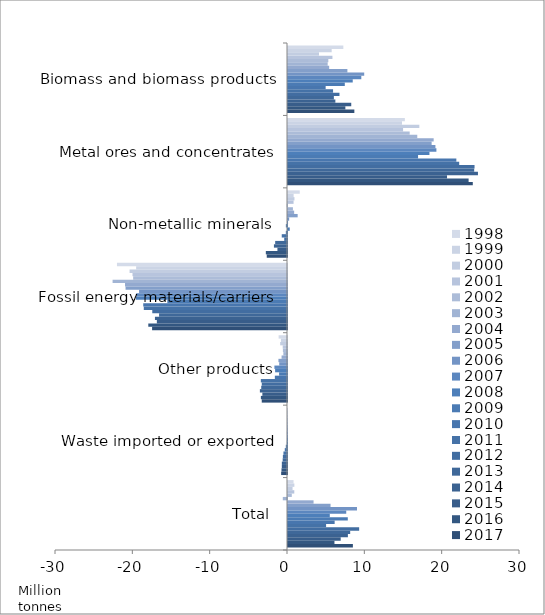
| Category | 1998 | 1999 | 2000 | 2001 | 2002 | 2003 | 2004 | 2005 | 2006 | 2007 | 2008 | 2009 | 2010 | 2011 | 2012 | 2013 | 2014 | 2015 | 2016 | 2017 |
|---|---|---|---|---|---|---|---|---|---|---|---|---|---|---|---|---|---|---|---|---|
| Biomass and biomass products | 7.155 | 5.646 | 4.006 | 5.745 | 5.214 | 5.129 | 5.324 | 7.68 | 9.854 | 9.479 | 8.37 | 7.344 | 4.868 | 5.828 | 6.657 | 5.93 | 6.124 | 8.178 | 7.418 | 8.58 |
| Metal ores and concentrates | 15.11 | 14.74 | 16.983 | 14.88 | 15.735 | 16.716 | 18.835 | 18.572 | 19.062 | 19.19 | 18.291 | 16.819 | 21.769 | 22.139 | 24.122 | 24.076 | 24.563 | 20.564 | 23.355 | 23.896 |
| Non-metallic minerals | 1.521 | 0.726 | 0.835 | 0.719 | -0.034 | 0.636 | 0.795 | 1.249 | 0.15 | 0.005 | -0.148 | 0.223 | -0.152 | -0.679 | -0.36 | -1.529 | -1.692 | -1.239 | -2.738 | -2.619 |
| Fossil energy materials/carriers | -21.988 | -19.506 | -20.354 | -19.978 | -19.893 | -22.552 | -20.945 | -20.876 | -19.131 | -19.5 | -19.543 | -15.474 | -18.591 | -18.518 | -17.422 | -16.543 | -17.077 | -16.83 | -17.935 | -17.445 |
| Other products | -1.083 | -0.784 | -0.882 | -0.553 | -0.531 | -0.472 | -0.702 | -1.108 | -1.006 | -1.629 | -1.537 | -1.024 | -1.573 | -3.384 | -3.263 | -3.334 | -3.507 | -3.187 | -3.379 | -3.265 |
| Waste imported or exported | 0 | 0 | 0 | 0 | -0.002 | -0.002 | -0.002 | -0.017 | -0.008 | -0.013 | -0.027 | -0.156 | -0.29 | -0.46 | -0.534 | -0.56 | -0.667 | -0.671 | -0.712 | -0.756 |
| Total | 0.715 | 0.822 | 0.588 | 0.812 | 0.49 | -0.545 | 3.305 | 5.501 | 8.921 | 7.531 | 5.405 | 7.731 | 6.032 | 4.925 | 9.2 | 8.041 | 7.745 | 6.815 | 6.008 | 8.39 |